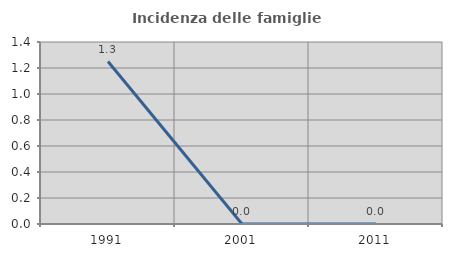
| Category | Incidenza delle famiglie numerose |
|---|---|
| 1991.0 | 1.25 |
| 2001.0 | 0 |
| 2011.0 | 0 |